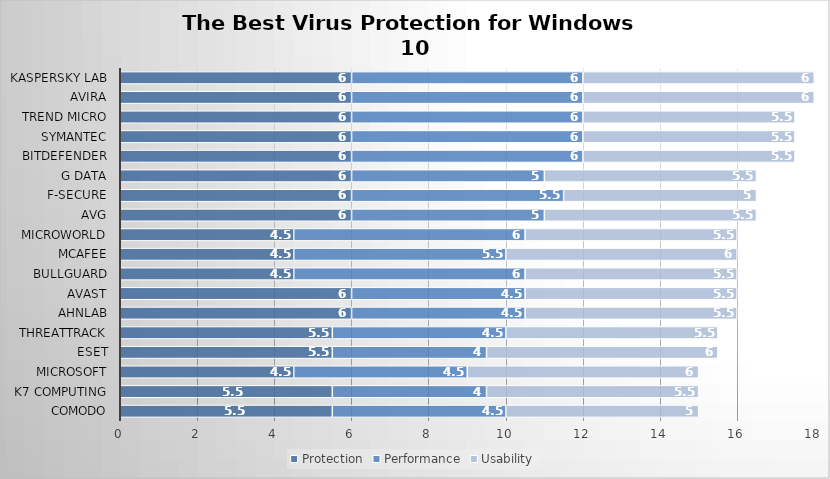
| Category | Protection | Performance | Usability |
|---|---|---|---|
| Comodo | 5.5 | 4.5 | 5 |
| K7 Computing | 5.5 | 4 | 5.5 |
| Microsoft | 4.5 | 4.5 | 6 |
| ESET | 5.5 | 4 | 6 |
| ThreatTrack | 5.5 | 4.5 | 5.5 |
| AhnLab | 6 | 4.5 | 5.5 |
| Avast | 6 | 4.5 | 5.5 |
| BullGuard | 4.5 | 6 | 5.5 |
| McAfee | 4.5 | 5.5 | 6 |
| Microworld | 4.5 | 6 | 5.5 |
| AVG | 6 | 5 | 5.5 |
| F-Secure | 6 | 5.5 | 5 |
| G Data | 6 | 5 | 5.5 |
| Bitdefender | 6 | 6 | 5.5 |
| Symantec | 6 | 6 | 5.5 |
| Trend Micro | 6 | 6 | 5.5 |
| Avira | 6 | 6 | 6 |
| Kaspersky Lab | 6 | 6 | 6 |